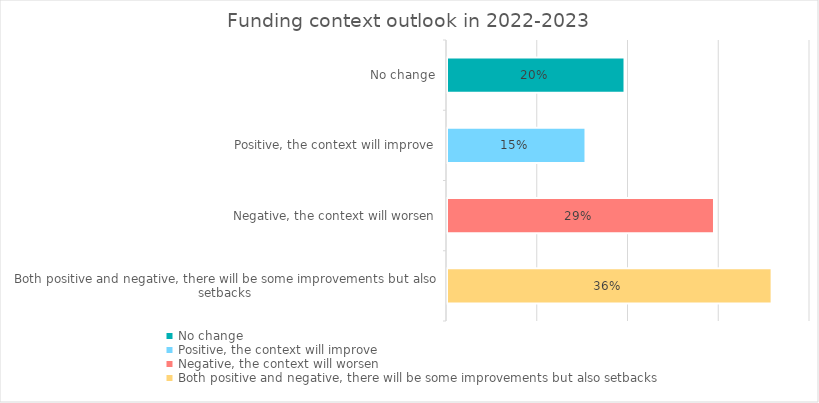
| Category | Series 0 |
|---|---|
| No change | 0.196 |
| Positive, the context will improve | 0.153 |
| Negative, the context will worsen | 0.294 |
| Both positive and negative, there will be some improvements but also setbacks | 0.358 |